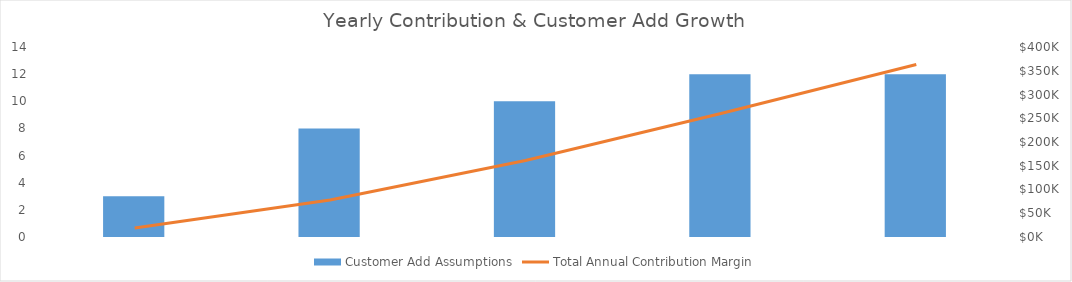
| Category | Customer Add Assumptions |
|---|---|
| Year 1 | 3 |
| Year 2 | 8 |
| Year 3 | 10 |
| Year 4 | 12 |
| Year 5 | 12 |